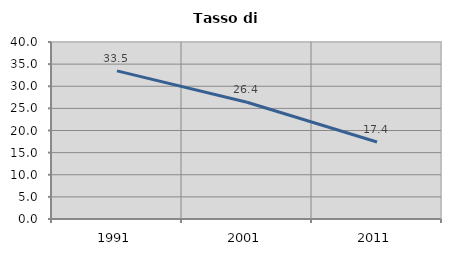
| Category | Tasso di disoccupazione   |
|---|---|
| 1991.0 | 33.475 |
| 2001.0 | 26.374 |
| 2011.0 | 17.406 |